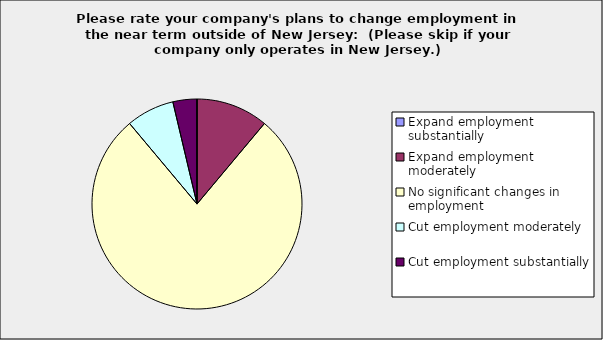
| Category | Series 0 |
|---|---|
| Expand employment substantially | 0 |
| Expand employment moderately | 0.111 |
| No significant changes in employment | 0.778 |
| Cut employment moderately | 0.074 |
| Cut employment substantially | 0.037 |